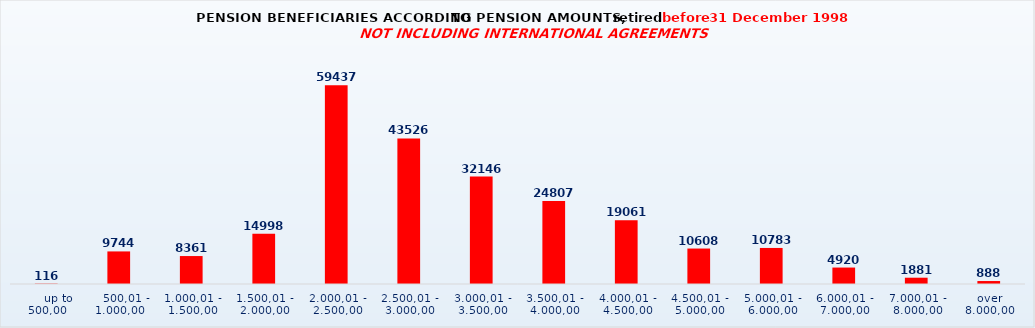
| Category | Series 0 |
|---|---|
|      up to 500,00 | 116 |
|    500,01 - 1.000,00 | 9744 |
| 1.000,01 - 1.500,00 | 8361 |
| 1.500,01 - 2.000,00 | 14998 |
| 2.000,01 - 2.500,00 | 59437 |
| 2.500,01 - 3.000,00 | 43526 |
| 3.000,01 - 3.500,00 | 32146 |
| 3.500,01 - 4.000,00 | 24807 |
| 4.000,01 - 4.500,00 | 19061 |
| 4.500,01 - 5.000,00 | 10608 |
| 5.000,01 - 6.000,00 | 10783 |
| 6.000,01 - 7.000,00 | 4920 |
| 7.000,01 - 8.000,00 | 1881 |
| over 8.000,00 | 888 |